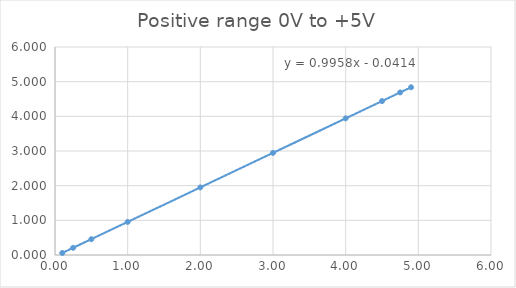
| Category | Series 0 |
|---|---|
| 4.9 | 4.838 |
| 4.75 | 4.689 |
| 4.5 | 4.44 |
| 4.0 | 3.942 |
| 3.0 | 2.946 |
| 2.0 | 1.95 |
| 1.0 | 0.954 |
| 0.5 | 0.456 |
| 0.25 | 0.208 |
| 0.1 | 0.059 |